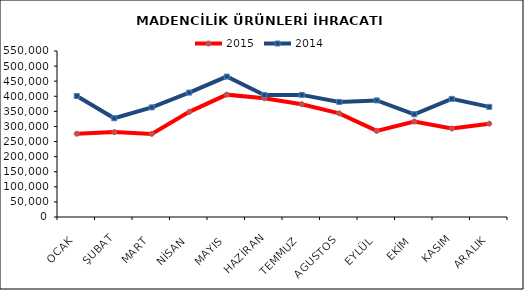
| Category | 2015 | 2014 |
|---|---|---|
| OCAK | 275912.264 | 400841.502 |
| ŞUBAT | 281272.031 | 327054.988 |
| MART | 275414.299 | 363215.163 |
| NİSAN | 348267.768 | 412190.479 |
| MAYIS | 405337.124 | 465269.183 |
| HAZİRAN | 393589.097 | 404037.654 |
| TEMMUZ | 373661.464 | 404536.068 |
| AGUSTOS | 343531.219 | 381295.276 |
| EYLÜL | 285231.307 | 386343.806 |
| EKİM | 316290.411 | 340422.889 |
| KASIM | 293236.565 | 391401.331 |
| ARALIK | 309310.795 | 364933.194 |